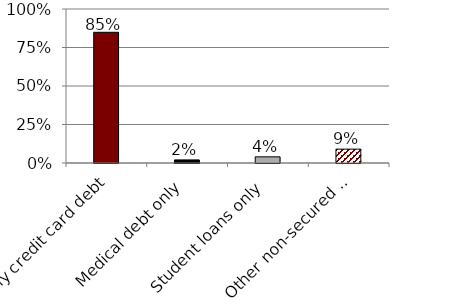
| Category | Series 0 |
|---|---|
| Any credit card debt | 0.849 |
| Medical debt only | 0.02 |
| Student loans only | 0.04 |
| Other non-secured debt only | 0.09 |